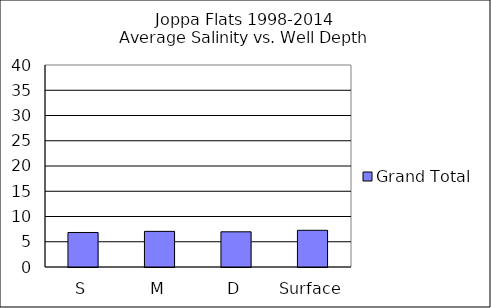
| Category | Grand Total |
|---|---|
| S | 6.832 |
| M | 7.056 |
| D | 6.97 |
| Surface | 7.265 |